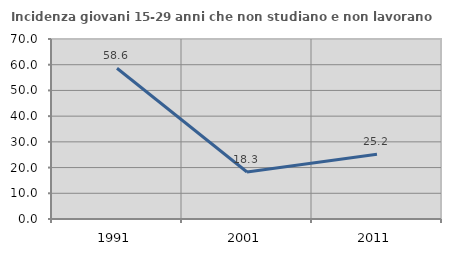
| Category | Incidenza giovani 15-29 anni che non studiano e non lavorano  |
|---|---|
| 1991.0 | 58.621 |
| 2001.0 | 18.286 |
| 2011.0 | 25.157 |